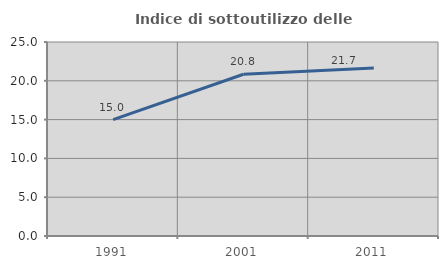
| Category | Indice di sottoutilizzo delle abitazioni  |
|---|---|
| 1991.0 | 15 |
| 2001.0 | 20.845 |
| 2011.0 | 21.656 |